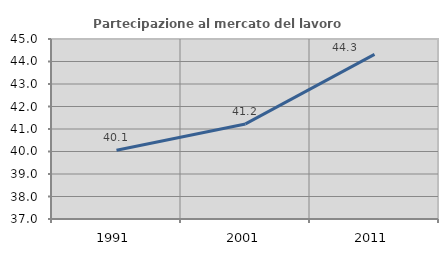
| Category | Partecipazione al mercato del lavoro  femminile |
|---|---|
| 1991.0 | 40.058 |
| 2001.0 | 41.225 |
| 2011.0 | 44.314 |